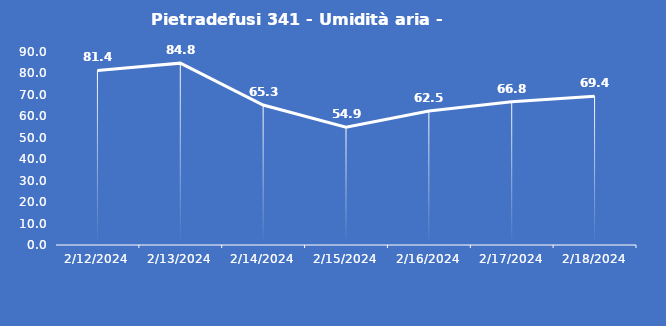
| Category | Pietradefusi 341 - Umidità aria - Grezzo (%) |
|---|---|
| 2/12/24 | 81.4 |
| 2/13/24 | 84.8 |
| 2/14/24 | 65.3 |
| 2/15/24 | 54.9 |
| 2/16/24 | 62.5 |
| 2/17/24 | 66.8 |
| 2/18/24 | 69.4 |